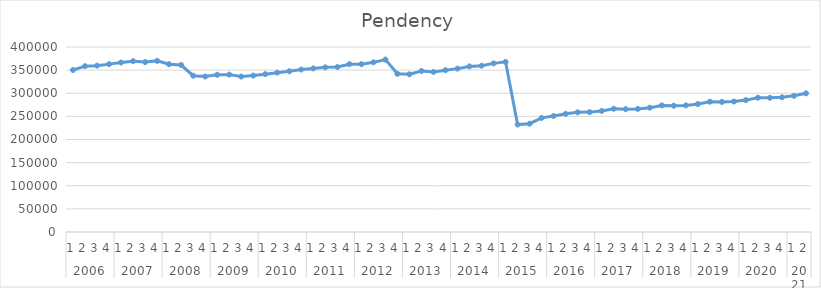
| Category | Pendency |
|---|---|
| 0 | 350304 |
| 1 | 358558 |
| 2 | 359698 |
| 3 | 362950 |
| 4 | 366495 |
| 5 | 369377 |
| 6 | 367409 |
| 7 | 369977 |
| 8 | 362738 |
| 9 | 361043 |
| 10 | 337942 |
| 11 | 336080 |
| 12 | 339921 |
| 13 | 340259 |
| 14 | 336040 |
| 15 | 338183 |
| 16 | 341300 |
| 17 | 344477 |
| 18 | 347618 |
| 19 | 351297 |
| 20 | 353654 |
| 21 | 355977 |
| 22 | 356707 |
| 23 | 362885 |
| 24 | 362948 |
| 25 | 366809 |
| 26 | 372807 |
| 27 | 341969 |
| 28 | 340963 |
| 29 | 348115 |
| 30 | 346162 |
| 31 | 349837 |
| 32 | 353240 |
| 33 | 357966 |
| 34 | 359572 |
| 35 | 364576 |
| 36 | 367825 |
| 37 | 232263 |
| 38 | 234137 |
| 39 | 246744 |
| 40 | 250888 |
| 41 | 255442 |
| 42 | 258826 |
| 43 | 259202.909 |
| 44 | 261725.743 |
| 45 | 266415.747 |
| 46 | 265578.974 |
| 47 | 266133.534 |
| 48 | 268834.02 |
| 49 | 273701.676 |
| 50 | 273042.554 |
| 51 | 273774.765 |
| 52 | 276652.902 |
| 53 | 281698.21 |
| 54 | 281216.739 |
| 55 | 282126.602 |
| 56 | 285182.39 |
| 57 | 290405.349 |
| 58 | 290101.53 |
| 59 | 291189.044 |
| 60 | 294422.484 |
| 61 | 299823.095 |